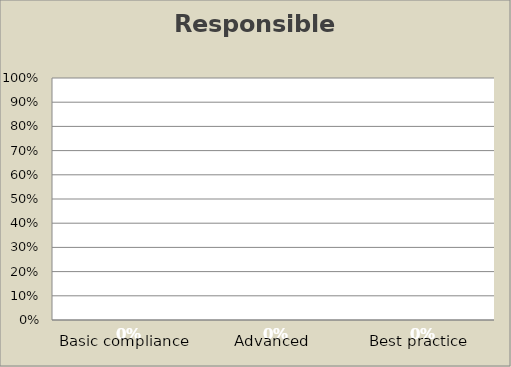
| Category | Responsible Purchasing |
|---|---|
| Basic compliance | 0 |
| Advanced | 0 |
| Best practice | 0 |